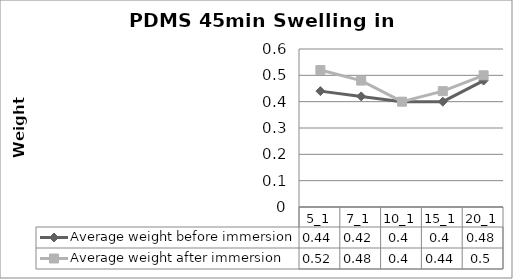
| Category | Average weight before immersion | Average weight after immersion |
|---|---|---|
| 5_1 | 0.44 | 0.52 |
| 7_1 | 0.42 | 0.48 |
| 10_1 | 0.4 | 0.4 |
| 15_1 | 0.4 | 0.44 |
| 20_1 | 0.48 | 0.5 |